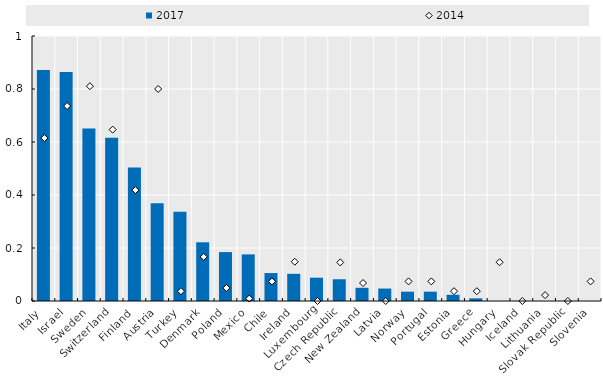
| Category | 2017 |
|---|---|
| Italy | 0.872 |
| Israel | 0.864 |
| Sweden | 0.65 |
| Switzerland | 0.616 |
| Finland | 0.504 |
| Austria | 0.369 |
| Turkey | 0.337 |
| Denmark | 0.222 |
| Poland | 0.185 |
| Mexico | 0.176 |
| Chile | 0.105 |
| Ireland | 0.103 |
| Luxembourg | 0.088 |
| Czech Republic | 0.082 |
| New Zealand | 0.05 |
| Latvia | 0.047 |
| Norway | 0.035 |
| Portugal | 0.035 |
| Estonia | 0.023 |
| Greece | 0.01 |
| Hungary | 0 |
| Iceland | 0 |
| Lithuania | 0 |
| Slovak Republic | 0 |
| Slovenia | 0 |